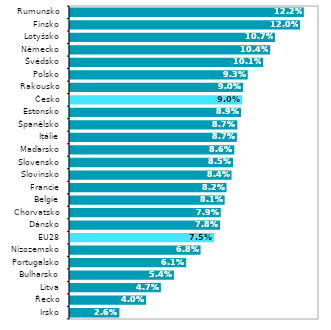
| Category | 2018* |
|---|---|
| Irsko | 0.026 |
| Řecko | 0.04 |
| Litva | 0.047 |
| Bulharsko | 0.054 |
| Portugalsko | 0.061 |
| Nizozemsko | 0.068 |
| EU28 | 0.075 |
| Dánsko | 0.078 |
| Chorvatsko | 0.079 |
| Belgie | 0.081 |
| Francie | 0.082 |
| Slovinsko | 0.084 |
| Slovensko | 0.085 |
| Maďarsko | 0.086 |
| Itálie | 0.087 |
| Španělsko | 0.087 |
| Estonsko | 0.089 |
| Česko | 0.09 |
| Rakousko | 0.09 |
| Polsko | 0.093 |
| Švédsko | 0.101 |
| Německo | 0.104 |
| Lotyšsko | 0.107 |
| Finsko | 0.12 |
| Rumunsko | 0.122 |